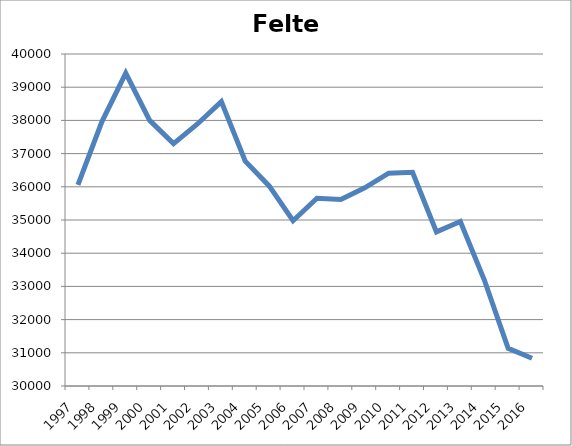
| Category | Felte elg |
|---|---|
| 1997.0 | 36059 |
| 1998.0 | 37957 |
| 1999.0 | 39423 |
| 2000.0 | 38000 |
| 2001.0 | 37300 |
| 2002.0 | 37892 |
| 2003.0 | 38564 |
| 2004.0 | 36770 |
| 2005.0 | 36026 |
| 2006.0 | 34978 |
| 2007.0 | 35657 |
| 2008.0 | 35620 |
| 2009.0 | 35971 |
| 2010.0 | 36409 |
| 2011.0 | 36435 |
| 2012.0 | 34643 |
| 2013.0 | 34956 |
| 2014.0 | 33199 |
| 2015.0 | 31136 |
| 2016.0 | 30835 |